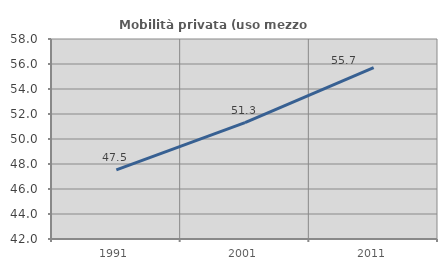
| Category | Mobilità privata (uso mezzo privato) |
|---|---|
| 1991.0 | 47.525 |
| 2001.0 | 51.306 |
| 2011.0 | 55.709 |